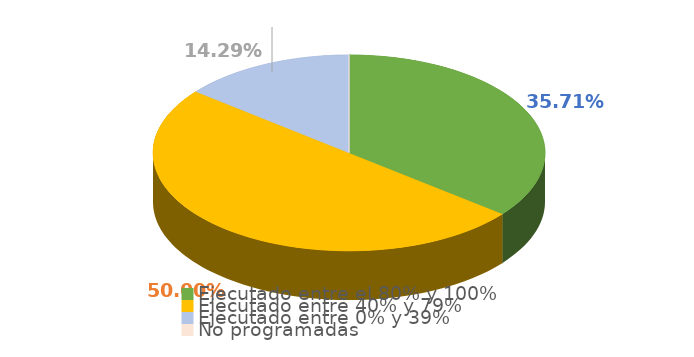
| Category | Series 0 |
|---|---|
| Ejecutado entre el 80% y 100% | 0.357 |
| Ejecutado entre 40% y 79% | 0.5 |
| Ejecutado entre 0% y 39% | 0.143 |
| No programadas | 0 |